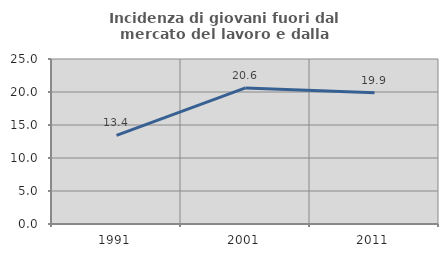
| Category | Incidenza di giovani fuori dal mercato del lavoro e dalla formazione  |
|---|---|
| 1991.0 | 13.433 |
| 2001.0 | 20.623 |
| 2011.0 | 19.89 |